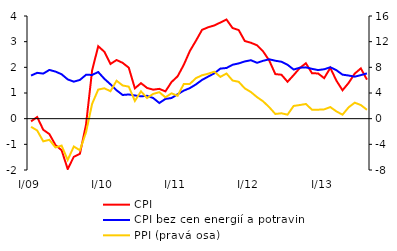
| Category | CPI | CPI bez cen energií a potravin |
|---|---|---|
| I/09 | -0.105 | 1.68 |
| 2 | 0.064 | 1.786 |
| 3 | -0.433 | 1.756 |
| 4 | -0.601 | 1.899 |
| 5 | -1.027 | 1.835 |
| 6 | -1.229 | 1.73 |
| 7 | -1.962 | 1.53 |
| 8 | -1.485 | 1.441 |
| 9 | -1.369 | 1.51 |
| 10 | -0.236 | 1.709 |
| 11 | 1.882 | 1.705 |
| 12 | 2.823 | 1.816 |
| I/10 | 2.607 | 1.554 |
| 2 | 2.13 | 1.34 |
| 3 | 2.285 | 1.107 |
| 4 | 2.174 | 0.923 |
| 5 | 1.987 | 0.942 |
| 6 | 1.182 | 0.904 |
| 7 | 1.383 | 0.87 |
| 8 | 1.197 | 0.89 |
| 9 | 1.13 | 0.804 |
| 10 | 1.161 | 0.611 |
| 11 | 1.062 | 0.768 |
| 12 | 1.428 | 0.804 |
| I/11 | 1.65 | 0.95 |
| 2 | 2.094 | 1.092 |
| 3 | 2.634 | 1.19 |
| 4 | 3.037 | 1.335 |
| 5 | 3.46 | 1.51 |
| 6 | 3.562 | 1.639 |
| 7 | 3.631 | 1.765 |
| 8 | 3.746 | 1.951 |
| 9 | 3.863 | 1.975 |
| 10 | 3.531 | 2.1 |
| 11 | 3.453 | 2.153 |
| 12 | 3.025 | 2.23 |
| I/12 | 2.957 | 2.277 |
| 2 | 2.859 | 2.177 |
| 3 | 2.619 | 2.255 |
| 4 | 2.266 | 2.314 |
| 5 | 1.736 | 2.257 |
| 6 | 1.712 | 2.218 |
| 7 | 1.437 | 2.1 |
| 8 | 1.697 | 1.913 |
| 9 | 1.973 | 1.985 |
| 10 | 2.159 | 1.999 |
| 11 | 1.771 | 1.941 |
| 12 | 1.761 | 1.893 |
| I/13 | 1.579 | 1.925 |
| 2 | 1.979 | 2.004 |
| 3 | 1.481 | 1.887 |
| 4 | 1.107 | 1.715 |
| 5 | 1.392 | 1.681 |
| 6 | 1.756 | 1.636 |
| 7 | 1.959 | 1.696 |
| 8 | 1.522 | 1.765 |